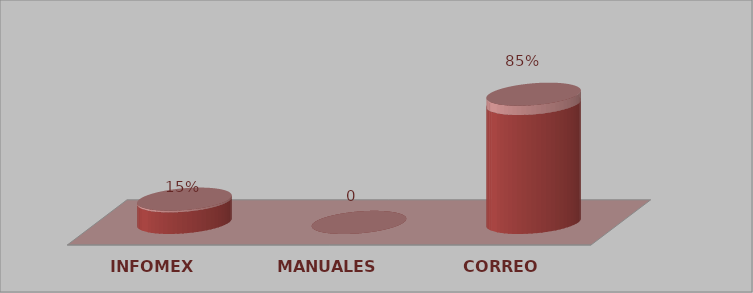
| Category | Series 0 | Series 1 |
|---|---|---|
| INFOMEX | 2 | 0.15 |
| MANUALES | 0 | 0 |
| CORREO | 11 | 0.85 |